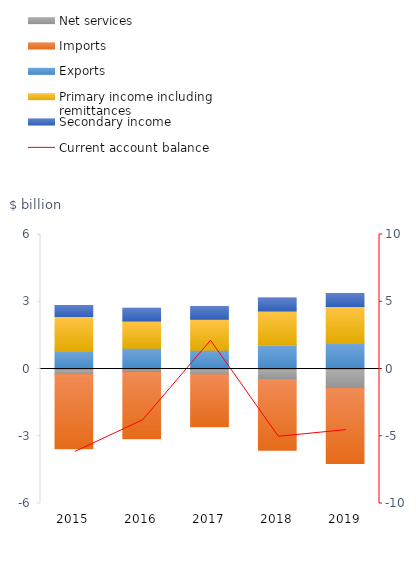
| Category | Net services | Imports | Exports | Primary income including remittances | Secondary income  |
|---|---|---|---|---|---|
| 2015.0 | -0.241 | -3.319 | 0.811 | 1.526 | 0.498 |
| 2016.0 | -0.138 | -2.974 | 0.923 | 1.214 | 0.572 |
| 2017.0 | -0.255 | -2.32 | 0.839 | 1.376 | 0.576 |
| 2018.0 | -0.471 | -3.15 | 1.073 | 1.512 | 0.58 |
| 2019.0 | -0.871 | -3.349 | 1.173 | 1.609 | 0.58 |